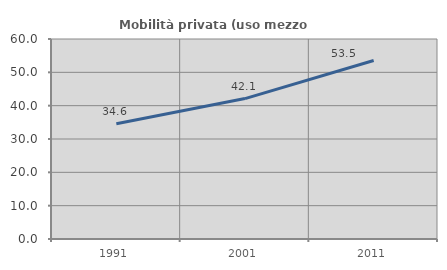
| Category | Mobilità privata (uso mezzo privato) |
|---|---|
| 1991.0 | 34.555 |
| 2001.0 | 42.13 |
| 2011.0 | 53.542 |